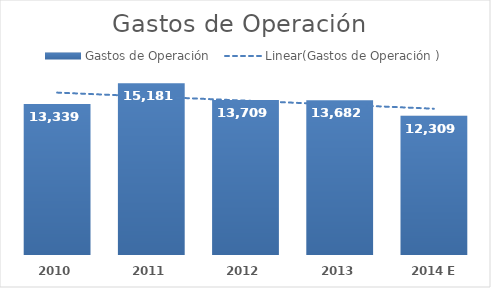
| Category | Gastos de Operación  |
|---|---|
| 2010 | 13339.17 |
| 2011 | 15181.037 |
| 2012 | 13708.769 |
| 2013 | 13681.503 |
| 2014 E | 12308.507 |